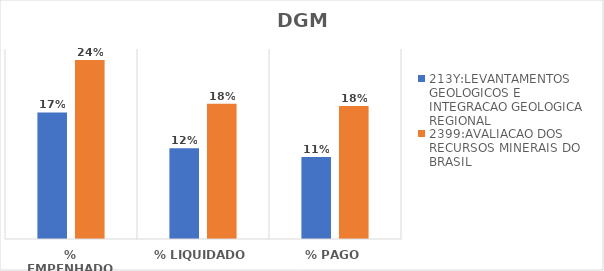
| Category | 213Y:LEVANTAMENTOS GEOLOGICOS E INTEGRACAO GEOLOGICA REGIONAL | 2399:AVALIACAO DOS RECURSOS MINERAIS DO BRASIL |
|---|---|---|
| % EMPENHADO | 0.167 | 0.236 |
| % LIQUIDADO | 0.119 | 0.178 |
| % PAGO | 0.108 | 0.175 |